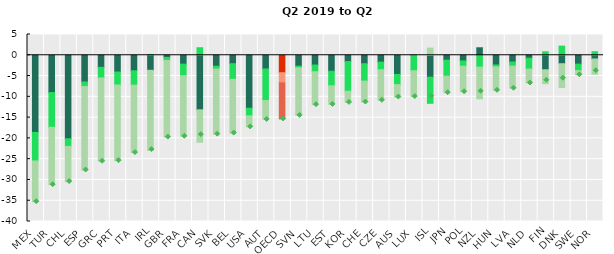
| Category | Joblessness (net of population change) | Hours per at work employees | 0 hours employment |
|---|---|---|---|
| MEX | -18.572 | -6.854 | -9.813 |
| TUR | -8.965 | -8.363 | -13.807 |
| CHL | -20.082 | -1.84 | -8.477 |
| ESP | -6.415 | -1.09 | -20.101 |
| GRC | -2.9 | -2.553 | -20.054 |
| PRT | -4.026 | -3.113 | -18.22 |
| ITA | -3.726 | -3.461 | -16.225 |
| IRL | -3.609 | 0.195 | -19.275 |
| GBR | -0.537 | -0.722 | -18.43 |
| FRA | -2.131 | -2.761 | -14.601 |
| CAN | -13.124 | 1.816 | -7.801 |
| SVK | -2.627 | -0.685 | -15.679 |
| BEL | -2.033 | -3.751 | -12.936 |
| USA | -12.736 | -1.826 | -2.674 |
| AUT | -3.294 | -7.575 | -4.571 |
| OECD | -4.192 | -2.453 | -8.674 |
| SVN | -2.612 | -0.397 | -11.445 |
| LTU | -2.345 | -1.608 | -7.929 |
| EST | -3.84 | -3.491 | -4.484 |
| KOR | -1.513 | -7.135 | -2.694 |
| CHE | -2.03 | -4.173 | -5.049 |
| CZE | -1.647 | -1.826 | -7.361 |
| AUS | -4.607 | -2.453 | -2.982 |
| LUX | -0.013 | -3.708 | -6.205 |
| ISL | -5.26 | -6.302 | 1.726 |
| JPN | -1.172 | -3.856 | -3.972 |
| POL | -1.354 | -1.274 | -6.142 |
| NZL | 1.808 | -2.851 | -7.629 |
| HUN | -2.322 | -0.461 | -5.656 |
| LVA | -1.609 | -1.006 | -5.316 |
| NLD | -0.699 | -2.612 | -3.359 |
| FIN | -3.478 | 0.841 | -3.354 |
| DNK | -2.029 | 2.209 | -5.714 |
| SWE | -2.131 | -1.558 | -1.001 |
| NOR | -0.888 | 0.856 | -3.687 |